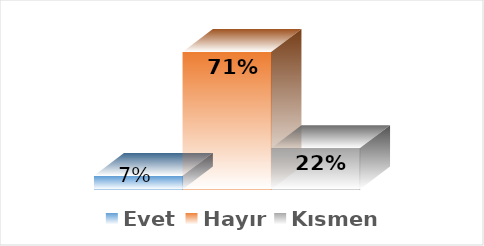
| Category | Evet | Hayır | Kısmen |
|---|---|---|---|
| 0 | 0.071 | 0.714 | 0.214 |